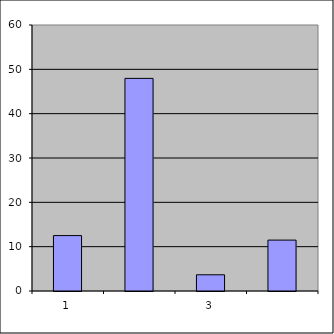
| Category | Series 0 |
|---|---|
| 0 | 12.5 |
| 1 | 47.959 |
| 2 | 3.656 |
| 3 | 11.482 |